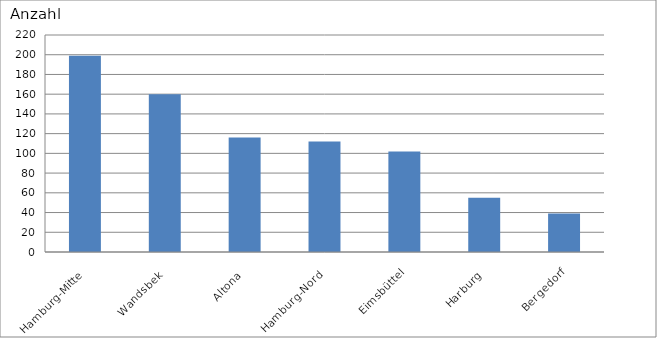
| Category | Hamburg-Mitte Wandsbek Altona Hamburg-Nord Eimsbüttel Harburg Bergedorf |
|---|---|
| Hamburg-Mitte | 199 |
| Wandsbek | 160 |
| Altona | 116 |
| Hamburg-Nord | 112 |
| Eimsbüttel | 102 |
| Harburg | 55 |
| Bergedorf | 39 |